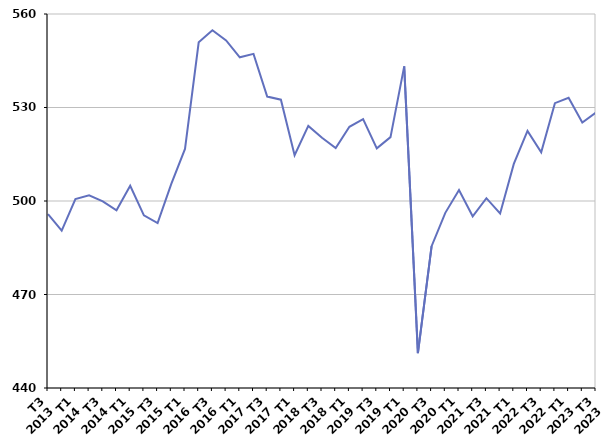
| Category | Ensemble des entrées en catégories A, B, C |
|---|---|
| T3
2013 | 495.8 |
| T4
2013 | 490.5 |
| T1
2014 | 500.6 |
| T2
2014 | 501.8 |
| T3
2014 | 499.9 |
| T4
2014 | 497 |
| T1
2015 | 504.9 |
| T2
2015 | 495.4 |
| T3
2015 | 492.9 |
| T4
2015 | 505.5 |
| T1
2016 | 516.7 |
| T2
2016 | 550.9 |
| T3
2016 | 554.8 |
| T4
2016 | 551.5 |
| T1
2017 | 546.1 |
| T2
2017 | 547.2 |
| T3
2017 | 533.5 |
| T4
2017 | 532.5 |
| T1
2018 | 514.7 |
| T2
2018 | 524.1 |
| T3
2018 | 520.3 |
| T4
2018 | 517 |
| T1
2019 | 523.8 |
| T2
2019 | 526.3 |
| T3
2019 | 516.9 |
| T4
2019 | 520.5 |
| T1
2020 | 543.2 |
| T2
2020 | 451.2 |
| T3
2020 | 485.5 |
| T4
2020 | 496.2 |
| T1
2021 | 503.5 |
| T2
2021 | 495.1 |
| T3
2021 | 500.9 |
| T4
2021 | 496 |
| T1
2022 | 511.9 |
| T2
2022 | 522.5 |
| T3
2022 | 515.6 |
| T4
2022 | 531.4 |
| T1
2023 | 533.1 |
| T2
2023 | 525.2 |
| T3
2023 | 528.4 |